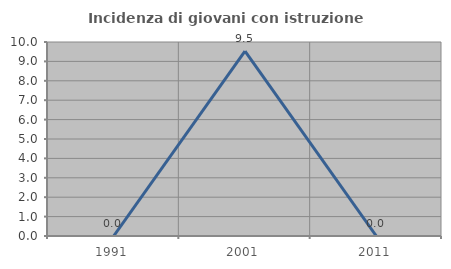
| Category | Incidenza di giovani con istruzione universitaria |
|---|---|
| 1991.0 | 0 |
| 2001.0 | 9.524 |
| 2011.0 | 0 |